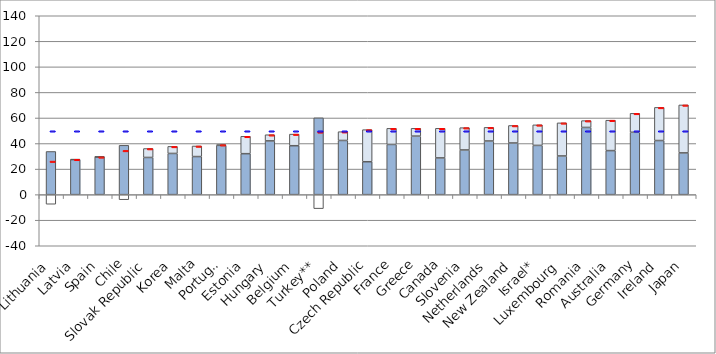
| Category | Gross Earnings | Net taxes | Net transfers |
|---|---|---|---|
| Lithuania | 33.78 | -7.52 | 0 |
| Latvia | 27.432 | 0 | 0.24 |
| Spain | 29.549 | 0 | 0.018 |
| Chile | 38.598 | -3.962 | 0 |
| Slovak Republic | 29.094 | 0 | 7.012 |
| Korea | 32.242 | 0 | 5.52 |
| Malta | 29.81 | 0 | 8.275 |
| Portugal | 38.561 | 0 | 0.542 |
| Estonia | 32.07 | 0 | 13.596 |
| Hungary | 42.076 | 0 | 4.815 |
| Belgium | 38.286 | 0 | 9.094 |
| Turkey** | 60.112 | -10.953 | 0 |
| Poland | 42.395 | 0 | 6.887 |
| Czech Republic | 25.755 | 0 | 25.111 |
| France | 39.283 | 0 | 12.606 |
| Greece | 45.808 | 0 | 6.109 |
| Canada | 28.749 | 0 | 23.173 |
| Slovenia | 34.978 | 0 | 17.445 |
| Netherlands | 41.996 | 0 | 10.647 |
| New Zealand | 40.433 | 0 | 13.689 |
| Israel* | 38.533 | 0 | 16.09 |
| Luxembourg | 30.282 | 0 | 25.895 |
| Romania | 52.601 | 0 | 5.33 |
| Australia | 34.477 | 0 | 23.789 |
| Germany | 48.81 | 0 | 14.827 |
| Ireland | 42.352 | 0 | 25.935 |
| Japan | 32.68 | 0 | 37.532 |